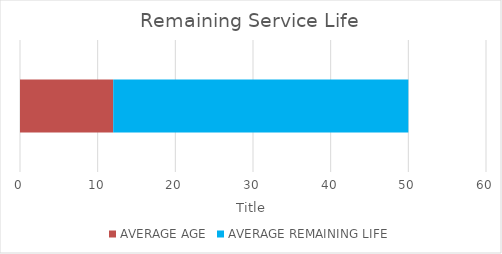
| Category | AVERAGE AGE | AVERAGE REMAINING LIFE |
|---|---|---|
| BACKLOG % OF TOTAL ASSET VALUE | 12 | 38 |